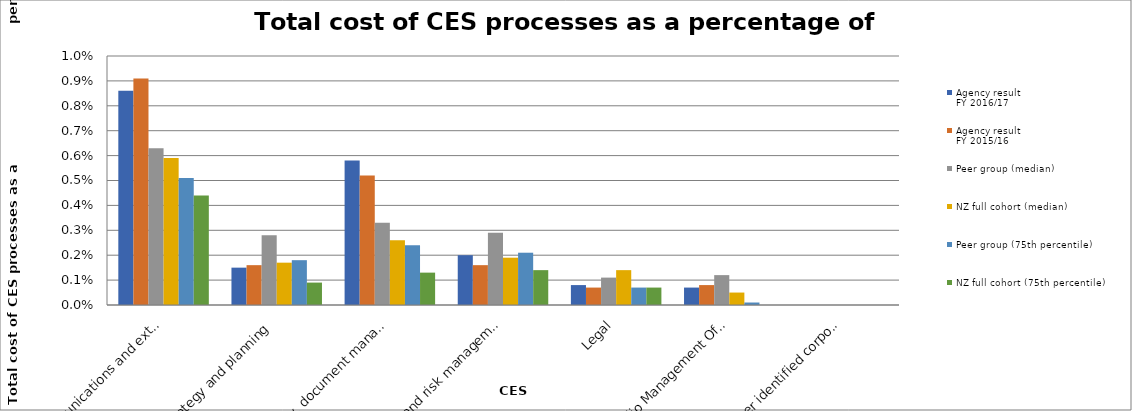
| Category | Agency result
FY 2016/17 | Agency result
FY 2015/16 | Peer group (median) | NZ full cohort (median) | Peer group (75th percentile) | NZ full cohort (75th percentile) |
|---|---|---|---|---|---|---|
| Communications and external relations (excluding the publications function) | 0.009 | 0.009 | 0.006 | 0.006 | 0.005 | 0.004 |
| Strategy and planning | 0.002 | 0.002 | 0.003 | 0.002 | 0.002 | 0.001 |
| Library, document management, archive and research | 0.006 | 0.005 | 0.003 | 0.003 | 0.002 | 0.001 |
| Audit and risk management | 0.002 | 0.002 | 0.003 | 0.002 | 0.002 | 0.001 |
| Legal | 0.001 | 0.001 | 0.001 | 0.001 | 0.001 | 0.001 |
| Portfolio Management Office | 0.001 | 0.001 | 0.001 | 0 | 0 | 0 |
| All other identified corporate costs | 0 | 0 | 0 | 0 | 0 | 0 |